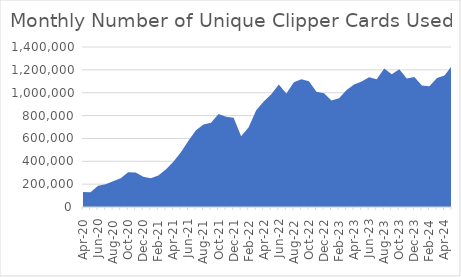
| Category | Number of Cards Used |
|---|---|
| 2020-04-01 | 132165 |
| 2020-05-01 | 128085 |
| 2020-06-01 | 185054 |
| 2020-07-01 | 199714 |
| 2020-08-01 | 225855 |
| 2020-09-01 | 251336 |
| 2020-10-01 | 305102 |
| 2020-11-01 | 302316 |
| 2020-12-01 | 264500 |
| 2021-01-01 | 251567 |
| 2021-02-01 | 275592 |
| 2021-03-01 | 327052 |
| 2021-04-01 | 396139 |
| 2021-05-01 | 478589 |
| 2021-06-01 | 580373 |
| 2021-07-01 | 670735 |
| 2021-08-01 | 721733 |
| 2021-09-01 | 737339 |
| 2021-10-01 | 814664 |
| 2021-11-01 | 788839 |
| 2021-12-01 | 781866 |
| 2022-01-01 | 619896 |
| 2022-02-01 | 696988 |
| 2022-03-01 | 845803 |
| 2022-04-01 | 924212 |
| 2022-05-01 | 986216 |
| 2022-06-01 | 1071592 |
| 2022-07-01 | 994075 |
| 2022-08-01 | 1090963 |
| 2022-09-01 | 1117425 |
| 2022-10-01 | 1101357 |
| 2022-11-01 | 1007699 |
| 2022-12-01 | 995266 |
| 2023-01-01 | 931450 |
| 2023-02-01 | 951011 |
| 2023-03-01 | 1023040 |
| 2023-04-01 | 1072327 |
| 2023-05-01 | 1099155 |
| 2023-06-01 | 1134944 |
| 2023-07-01 | 1118764 |
| 2023-08-01 | 1212111 |
| 2023-09-01 | 1162105 |
| 2023-10-01 | 1205360 |
| 2023-11-01 | 1125241 |
| 2023-12-01 | 1137979 |
| 2024-01-01 | 1062669 |
| 2024-02-01 | 1056880 |
| 2024-03-01 | 1128543 |
| 2024-04-01 | 1150696 |
| 2024-05-01 | 1237490 |